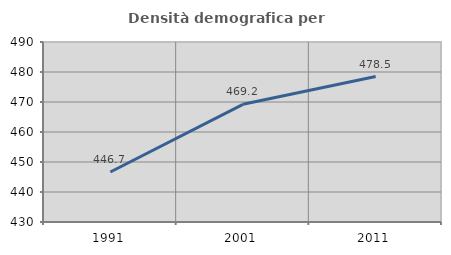
| Category | Densità demografica |
|---|---|
| 1991.0 | 446.665 |
| 2001.0 | 469.233 |
| 2011.0 | 478.484 |